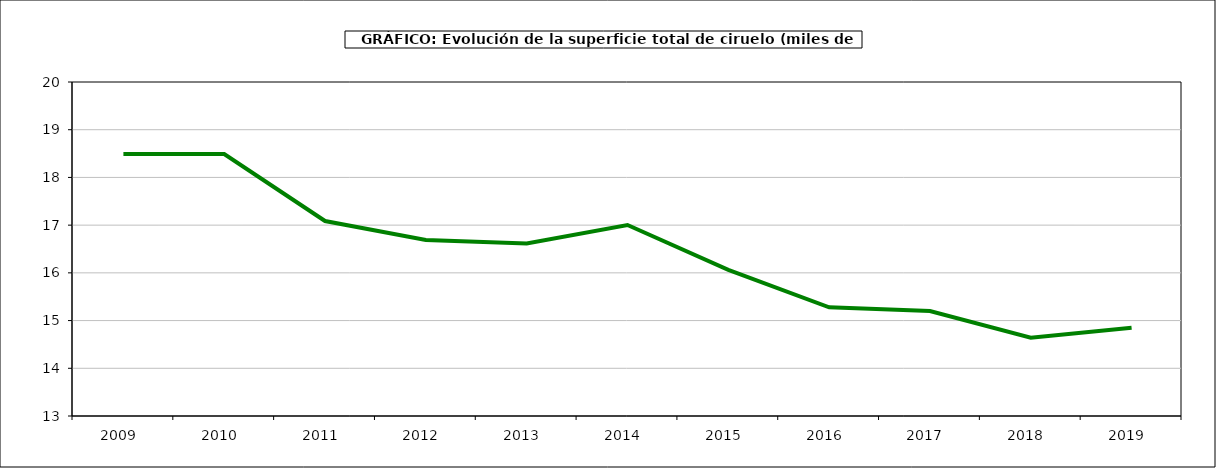
| Category | superficie ciruelo |
|---|---|
| 2009.0 | 18.489 |
| 2010.0 | 18.489 |
| 2011.0 | 17.086 |
| 2012.0 | 16.687 |
| 2013.0 | 16.614 |
| 2014.0 | 17.003 |
| 2015.0 | 16.064 |
| 2016.0 | 15.278 |
| 2017.0 | 15.199 |
| 2018.0 | 14.64 |
| 2019.0 | 14.851 |